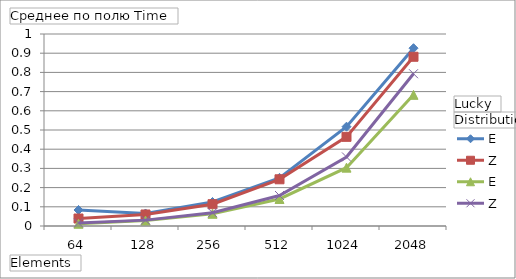
| Category | N - E | N - Z | Y - E | Y - Z |
|---|---|---|---|---|
| 64 | 0.083 | 0.039 | 0.012 | 0.016 |
| 128 | 0.065 | 0.06 | 0.028 | 0.031 |
| 256 | 0.125 | 0.114 | 0.064 | 0.069 |
| 512 | 0.251 | 0.243 | 0.141 | 0.159 |
| 1024 | 0.517 | 0.464 | 0.304 | 0.359 |
| 2048 | 0.926 | 0.881 | 0.683 | 0.793 |